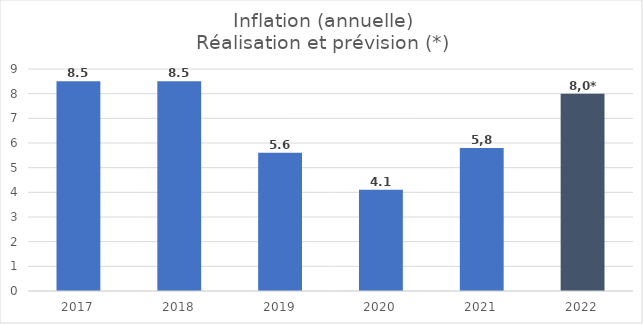
| Category | Inflation |
|---|---|
| 2017.0 | 8.5 |
| 2018.0 | 8.5 |
| 2019.0 | 5.6 |
| 2020.0 | 4.1 |
| 2021.0 | 5.8 |
| 2022.0 | 8 |